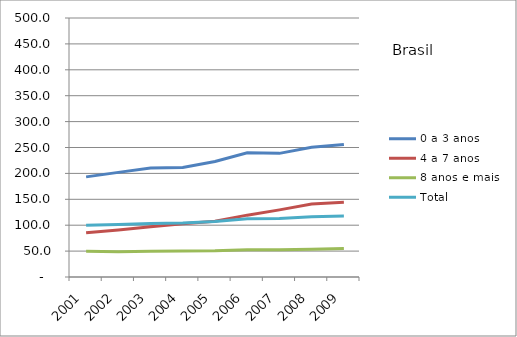
| Category | 0 a 3 anos | 4 a 7 anos | 8 anos e mais | Total |
|---|---|---|---|---|
| 2001.0 | 193.3 | 85.2 | 49.5 | 99.9 |
| 2002.0 | 202 | 90.8 | 48.9 | 101.5 |
| 2003.0 | 210.3 | 97.1 | 49.7 | 103.5 |
| 2004.0 | 211.2 | 102.7 | 50.3 | 104.3 |
| 2005.0 | 223 | 107.6 | 50.7 | 107 |
| 2006.0 | 240 | 119.4 | 52.8 | 112.5 |
| 2007.0 | 238.7 | 129.6 | 52.5 | 112.8 |
| 2008.0 | 250.3 | 141.1 | 53.6 | 116.4 |
| 2009.0 | 255.8 | 144.3 | 54.9 | 117.7 |